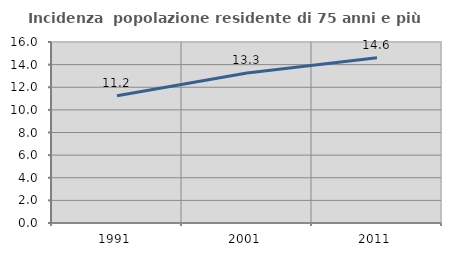
| Category | Incidenza  popolazione residente di 75 anni e più |
|---|---|
| 1991.0 | 11.249 |
| 2001.0 | 13.268 |
| 2011.0 | 14.606 |